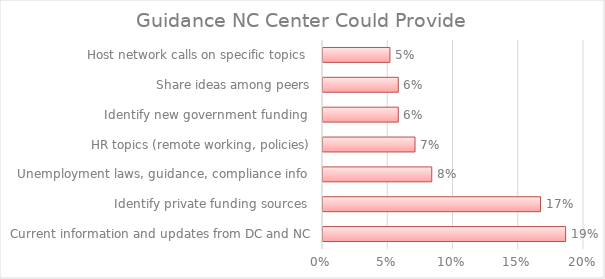
| Category | Total | Total % |
|---|---|---|
| Current information and updates from DC and NC |  | 0.186 |
| Identify private funding sources  |  | 0.167 |
| Unemployment laws, guidance, compliance info  |  | 0.083 |
| HR topics (remote working, policies) |  | 0.071 |
| Identify new government funding  |  | 0.058 |
| Share ideas among peers |  | 0.058 |
| Host network calls on specific topics  |  | 0.051 |